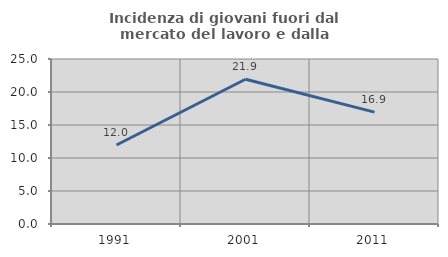
| Category | Incidenza di giovani fuori dal mercato del lavoro e dalla formazione  |
|---|---|
| 1991.0 | 11.974 |
| 2001.0 | 21.931 |
| 2011.0 | 16.949 |